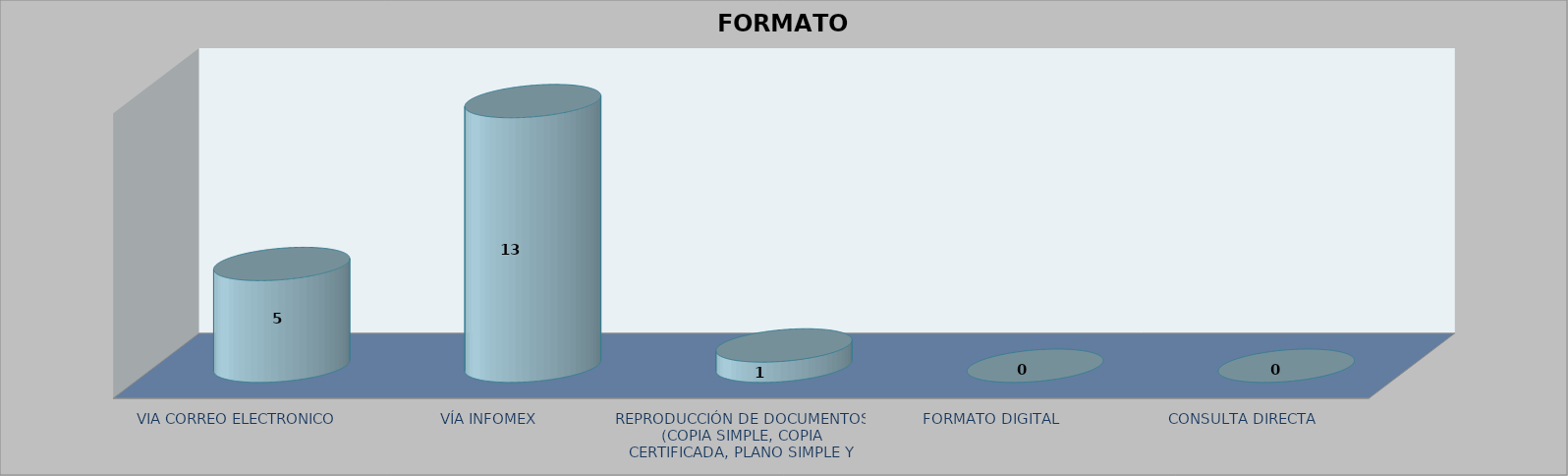
| Category |        FORMATO SOLICITADO | Series 1 | Series 2 |
|---|---|---|---|
| VIA CORREO ELECTRONICO |  |  | 5 |
| VÍA INFOMEX |  |  | 13 |
| REPRODUCCIÓN DE DOCUMENTOS (COPIA SIMPLE, COPIA CERTIFICADA, PLANO SIMPLE Y PLANO CERTIFICADO) |  |  | 1 |
| FORMATO DIGITAL |  |  | 0 |
| CONSULTA DIRECTA |  |  | 0 |